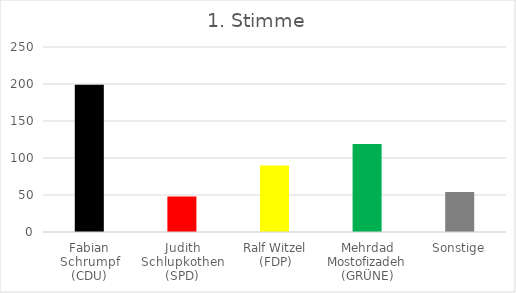
| Category | Stimmen |
|---|---|
| Fabian Schrumpf (CDU) | 199 |
| Judith Schlupkothen (SPD) | 48 |
| Ralf Witzel (FDP) | 90 |
| Mehrdad Mostofizadeh (GRÜNE) | 119 |
| Sonstige | 54 |